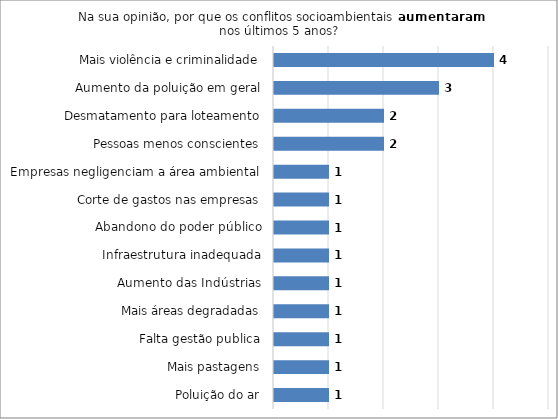
| Category | Series 0 |
|---|---|
| Poluição do ar | 1 |
| Mais pastagens | 1 |
| Falta gestão publica | 1 |
| Mais áreas degradadas | 1 |
| Aumento das Indústrias | 1 |
| Infraestrutura inadequada | 1 |
| Abandono do poder público | 1 |
| Corte de gastos nas empresas | 1 |
| Empresas negligenciam a área ambiental | 1 |
| Pessoas menos conscientes | 2 |
| Desmatamento para loteamento | 2 |
| Aumento da poluição em geral | 3 |
| Mais violência e criminalidade | 4 |